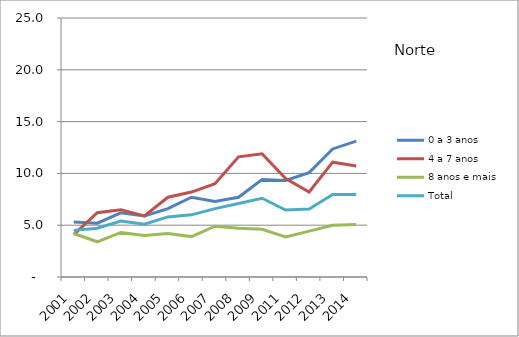
| Category | 0 a 3 anos | 4 a 7 anos | 8 anos e mais | Total |
|---|---|---|---|---|
| 2001.0 | 5.3 | 4.1 | 4.2 | 4.5 |
| 2002.0 | 5.2 | 6.2 | 3.4 | 4.7 |
| 2003.0 | 6.2 | 6.5 | 4.3 | 5.4 |
| 2004.0 | 5.9 | 5.9 | 4 | 5.1 |
| 2005.0 | 6.6 | 7.7 | 4.2 | 5.8 |
| 2006.0 | 7.7 | 8.2 | 3.9 | 6 |
| 2007.0 | 7.3 | 9 | 4.9 | 6.6 |
| 2008.0 | 7.7 | 11.6 | 4.7 | 7.1 |
| 2009.0 | 9.4 | 11.9 | 4.6 | 7.6 |
| 2011.0 | 9.322 | 9.502 | 3.872 | 6.465 |
| 2012.0 | 10.073 | 8.21 | 4.432 | 6.557 |
| 2013.0 | 12.361 | 11.085 | 4.986 | 7.954 |
| 2014.0 | 13.121 | 10.705 | 5.057 | 7.971 |